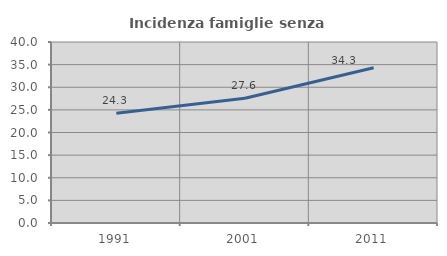
| Category | Incidenza famiglie senza nuclei |
|---|---|
| 1991.0 | 24.264 |
| 2001.0 | 27.556 |
| 2011.0 | 34.32 |